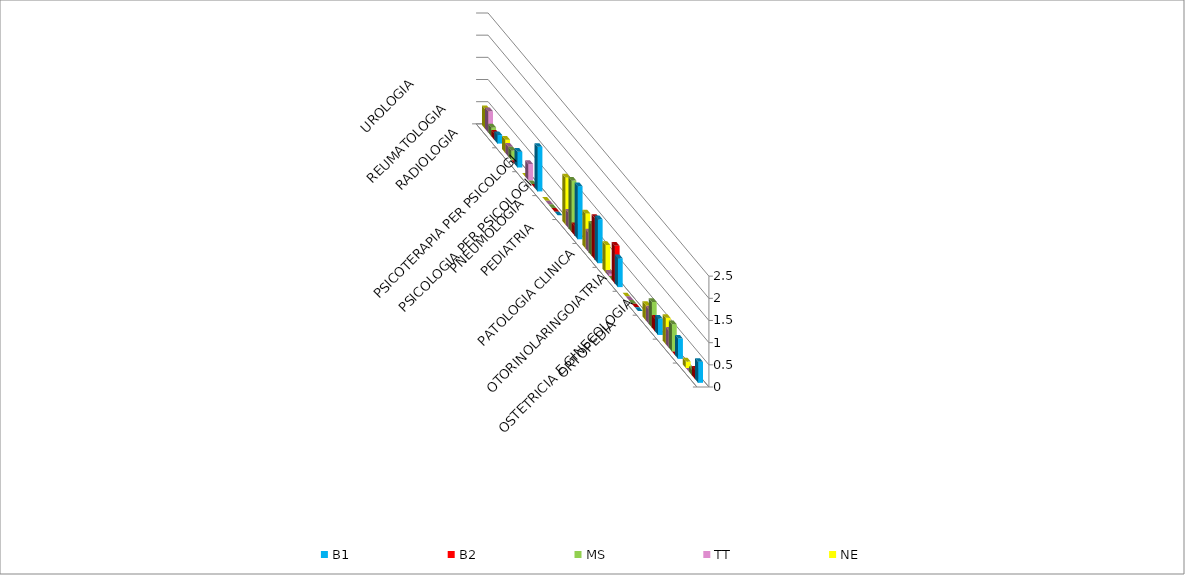
| Category | B1 | B2 | MS | TT | NE |
|---|---|---|---|---|---|
| ORTOPEDIA | 0.473 | 0.212 | 0.127 | 0 | 0.148 |
| OSTETRICIA E GINECOLOGIA | 0.458 | 0 | 0.615 | 0.387 | 0.594 |
| OTORINOLARINGOIATRIA | 0.37 | 0.283 | 0.579 | 0.332 | 0.346 |
| PATOLOGIA CLINICA | 0 | 0 | 0 | 0 | 0 |
| PEDIATRIA | 0.651 | 0.849 | 0 | 0.055 | 0.618 |
| PNEUMOLOGIA | 0.991 | 0.938 | 0.705 | 0.443 | 0.792 |
| PSICOLOGIA PER PSICOLOGI | 1.198 | 0.212 | 1.158 | 0.35 | 1.064 |
| PSICOTERAPIA PER PSICOLOGI | 0 | 0 | 0 | 0 | 0 |
| RADIOLOGIA | 1.005 | 0 | 0 | 0.369 | 0 |
| REUMATOLOGIA | 0.355 | 0 | 0.217 | 0.221 | 0.297 |
| UROLOGIA | 0.192 | 0.142 | 0.199 | 0.48 | 0.445 |